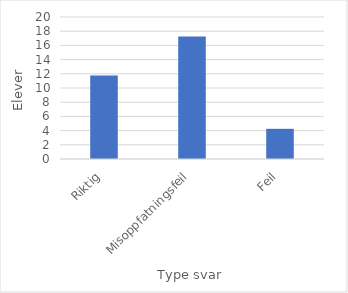
| Category | Series 0 |
|---|---|
| Riktig | 11.75 |
| Misoppfatningsfeil | 17.25 |
| Feil | 4.25 |